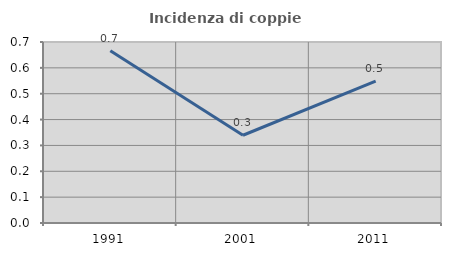
| Category | Incidenza di coppie miste |
|---|---|
| 1991.0 | 0.666 |
| 2001.0 | 0.339 |
| 2011.0 | 0.548 |